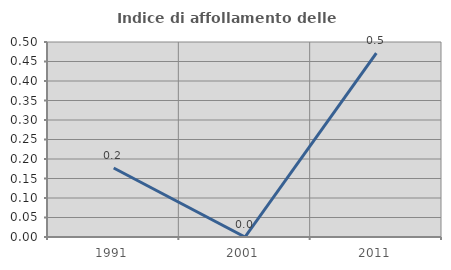
| Category | Indice di affollamento delle abitazioni  |
|---|---|
| 1991.0 | 0.177 |
| 2001.0 | 0 |
| 2011.0 | 0.472 |